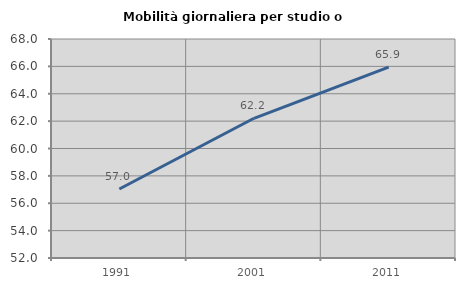
| Category | Mobilità giornaliera per studio o lavoro |
|---|---|
| 1991.0 | 57.04 |
| 2001.0 | 62.207 |
| 2011.0 | 65.947 |